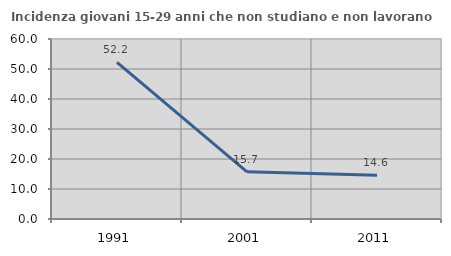
| Category | Incidenza giovani 15-29 anni che non studiano e non lavorano  |
|---|---|
| 1991.0 | 52.231 |
| 2001.0 | 15.736 |
| 2011.0 | 14.583 |